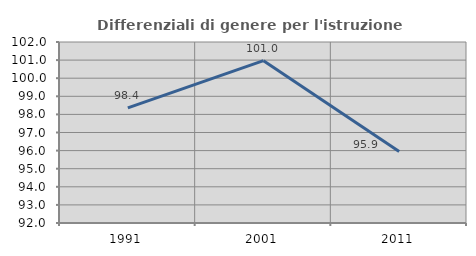
| Category | Differenziali di genere per l'istruzione superiore |
|---|---|
| 1991.0 | 98.361 |
| 2001.0 | 100.969 |
| 2011.0 | 95.944 |